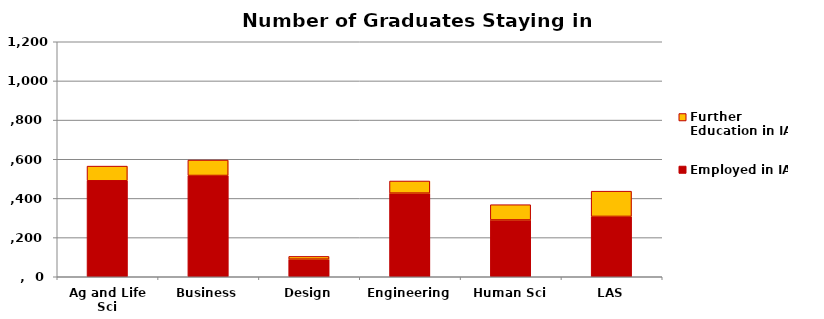
| Category | Employed in IA | Further Education in IA |
|---|---|---|
| Ag and Life Sci | 490 | 75 |
| Business | 517 | 79 |
| Design | 90 | 14 |
| Engineering | 427 | 62 |
| Human Sci | 290 | 78 |
| LAS | 308 | 129 |